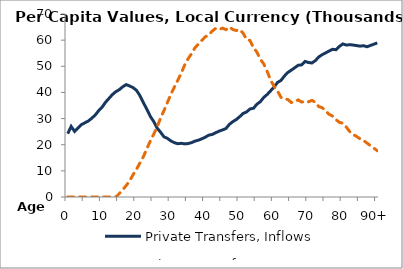
| Category | Private Transfers, Inflows | Private Transfers, Outflows |
|---|---|---|
| 0 | 24219.385 | 0 |
|  | 27001.633 | 0 |
| 2 | 25081.131 | 0 |
| 3 | 26373.823 | 0 |
| 4 | 27689.099 | 0 |
| 5 | 28393.296 | 0 |
| 6 | 29079.438 | 0 |
| 7 | 30121.116 | 0 |
| 8 | 31368.519 | 0 |
| 9 | 33013.113 | 0 |
| 10 | 34377.362 | 0 |
| 11 | 36244.128 | 0 |
| 12 | 37722.302 | 0 |
| 13 | 39189.806 | 0 |
| 14 | 40294.143 | 0 |
| 15 | 41064.646 | 1311.835 |
| 16 | 42180.273 | 2767.341 |
| 17 | 42999.912 | 4387.83 |
| 18 | 42472.375 | 6176.527 |
| 19 | 41829.225 | 8521.353 |
| 20 | 40786.895 | 10619.454 |
| 21 | 38762.046 | 13051.416 |
| 22 | 36083.303 | 15402.212 |
| 23 | 33566.726 | 18499.85 |
| 24 | 30872.773 | 21348 |
| 25 | 28880.973 | 24017.395 |
| 26 | 26365.196 | 26870.78 |
| 27 | 24763.734 | 30202.799 |
| 28 | 23014.946 | 33106.055 |
| 29 | 22412.113 | 36218.253 |
| 30 | 21438.897 | 39279.318 |
| 31 | 20780.181 | 42056.045 |
| 32 | 20383.376 | 44627.698 |
| 33 | 20530.181 | 47388.302 |
| 34 | 20313.429 | 50478.635 |
| 35 | 20434.029 | 52865.217 |
| 36 | 20804.168 | 54815.728 |
| 37 | 21366.84 | 57093.953 |
| 38 | 21744.791 | 58492.259 |
| 39 | 22267.147 | 59947.056 |
| 40 | 22874.744 | 61272.714 |
| 41 | 23650.789 | 62010.67 |
| 42 | 23922.714 | 63453.368 |
| 43 | 24560.236 | 64467.234 |
| 44 | 25192.885 | 64079.473 |
| 45 | 25638.909 | 64581.664 |
| 46 | 26192.851 | 64019.627 |
| 47 | 27785.04 | 65001.985 |
| 48 | 28825.962 | 64055.856 |
| 49 | 29615.035 | 63688.114 |
| 50 | 30730.379 | 64037.668 |
| 51 | 31969.937 | 62638.501 |
| 52 | 32532.291 | 60278.227 |
| 53 | 33682.051 | 59866.629 |
| 54 | 33934.113 | 57124.22 |
| 55 | 35487.248 | 55442.53 |
| 56 | 36462.383 | 52705.285 |
| 57 | 38101.924 | 50903.077 |
| 58 | 39219.147 | 47997.634 |
| 59 | 40637.884 | 44685.29 |
| 60 | 42052.235 | 42286.787 |
| 61 | 43821.736 | 40558.912 |
| 62 | 44584.225 | 38129.16 |
| 63 | 46289.32 | 37512.154 |
| 64 | 47641.799 | 37285.128 |
| 65 | 48524.411 | 36152.109 |
| 66 | 49441.127 | 36433.629 |
| 67 | 50396.879 | 37136.916 |
| 68 | 50540.362 | 36322.638 |
| 69 | 51867.282 | 36539.337 |
| 70 | 51443.02 | 36430.7 |
| 71 | 51268.32 | 36941.08 |
| 72 | 52176.458 | 36255.363 |
| 73 | 53586.865 | 34566.504 |
| 74 | 54452.468 | 34175.028 |
| 75 | 55128.212 | 32879.49 |
| 76 | 55863.538 | 31649.868 |
| 77 | 56495.38 | 30950.747 |
| 78 | 56343.418 | 29592.938 |
| 79 | 57616.424 | 28534.92 |
| 80 | 58552.007 | 28242.856 |
| 81 | 58113.397 | 26737.239 |
| 82 | 58267.304 | 25008.806 |
| 83 | 58124.564 | 23861.09 |
| 84 | 57910.816 | 23165.475 |
| 85 | 57703.62 | 22221.24 |
| 86 | 57872.928 | 21628.171 |
| 87 | 57468.537 | 20645.931 |
| 88 | 57960.356 | 19663.691 |
| 89 | 58452.175 | 18681.452 |
| 90+ | 58944.958 | 17699.212 |